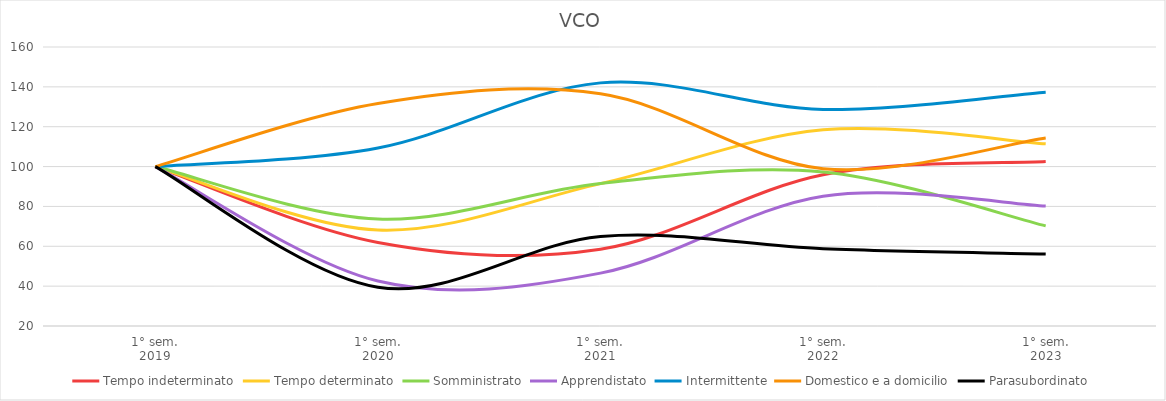
| Category | Tempo indeterminato | Tempo determinato | Somministrato | Apprendistato | Intermittente | Domestico e a domicilio | Parasubordinato |
|---|---|---|---|---|---|---|---|
| 1° sem.
2019 | 100 | 100 | 100 | 100 | 100 | 100 | 100 |
| 1° sem.
2020 | 61.945 | 68.172 | 73.659 | 42.574 | 109.333 | 131.622 | 39.474 |
| 1° sem.
2021 | 58.532 | 91.427 | 91.463 | 46.535 | 142 | 136.486 | 64.912 |
| 1° sem.
2022 | 95.904 | 118.429 | 97.317 | 85.149 | 128.667 | 98.919 | 58.772 |
| 1° sem.
2023 | 102.56 | 111.396 | 70.244 | 80.198 | 137.333 | 114.324 | 56.14 |